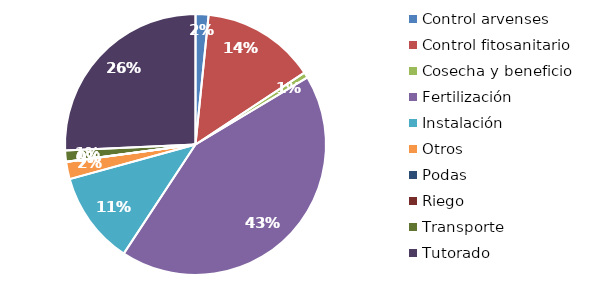
| Category | Valor |
|---|---|
| Control arvenses | 99472 |
| Control fitosanitario | 872671 |
| Cosecha y beneficio | 43113.996 |
| Fertilización | 2650491 |
| Instalación | 709800 |
| Otros | 132658 |
| Podas | 0 |
| Riego | 0 |
| Transporte | 86255 |
| Tutorado | 1591901 |